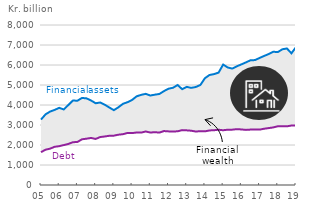
| Category | Financial assets | Debt |
|---|---|---|
| 05 | 3272.186 | 1643.093 |
|  | 3532.802 | 1764.809 |
|  | 3672.547 | 1817.598 |
|  | 3755.667 | 1911.022 |
| 06 | 3857.724 | 1942.636 |
|  | 3776.527 | 1996.758 |
|  | 3998.384 | 2053.714 |
|  | 4222.361 | 2138.443 |
| 07 | 4215.558 | 2151.845 |
|  | 4353.072 | 2285.058 |
|  | 4331.642 | 2315.875 |
|  | 4223.693 | 2352.937 |
| 08 | 4088.421 | 2302.067 |
|  | 4123.649 | 2398.769 |
|  | 4014.451 | 2425.657 |
|  | 3875.599 | 2461.751 |
| 09 | 3742.045 | 2467.138 |
|  | 3885.643 | 2515.771 |
|  | 4059.448 | 2540.788 |
|  | 4140.374 | 2601.547 |
| 10 | 4252.82 | 2594.971 |
|  | 4434.044 | 2625.297 |
|  | 4507.349 | 2620.645 |
|  | 4556.922 | 2675.662 |
| 11 | 4474.269 | 2623.007 |
|  | 4515.962 | 2640.884 |
|  | 4552.115 | 2620.915 |
|  | 4694.229 | 2697.12 |
| 12 | 4815.488 | 2681.106 |
|  | 4862.275 | 2675.466 |
|  | 4999.558 | 2684.209 |
|  | 4790.627 | 2743.915 |
| 13 | 4905.401 | 2732.392 |
|  | 4857.483 | 2714.159 |
|  | 4900.307 | 2673.057 |
|  | 5002.555 | 2692.516 |
| 14 | 5338.91 | 2682.556 |
|  | 5500.679 | 2727.766 |
|  | 5544.028 | 2739.008 |
|  | 5619.862 | 2763.566 |
| 15 | 6021.801 | 2737.414 |
|  | 5876.944 | 2764.859 |
|  | 5821.519 | 2766.914 |
|  | 5934.333 | 2792.133 |
| 16 | 6030.619 | 2778.117 |
|  | 6130.009 | 2755.168 |
|  | 6236.124 | 2770.619 |
|  | 6245.605 | 2777.701 |
| 17 | 6352.352 | 2769.171 |
|  | 6453.858 | 2813.937 |
|  | 6546.61 | 2845.542 |
|  | 6663.218 | 2878.636 |
| 18 | 6645.151 | 2935.465 |
|  | 6785.515 | 2935.828 |
|  | 6827.891 | 2932.36 |
|  | 6584.874 | 2973.99 |
| 19 | 6892.491 | 2976.004 |